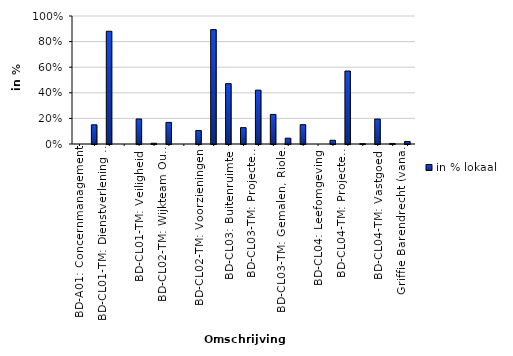
| Category | in % lokaal |
|---|---|
| BD-A01: Concernmanagement | 0 |
| BD-CL01: Dienstverlening, Veiligheid & Bestuur | 0.15 |
| BD-CL01-TM: Dienstverlening & Communicatie | 0.881 |
| BD-CL01-TM: Burgerzaken | 0 |
| BD-CL01-TM: Veiligheid | 0.196 |
| BD-CL01-TM: Bestuursadvies & -ondersteuning | 0.006 |
| BD-CL02-TM: Wijkteam Oud Barendrecht | 0.169 |
| BD-CL02-TM: Wijkteam Carnisselande | 0 |
| BD-CL02-TM: Voorzieningen | 0.106 |
| BD-CL02-TM: Beleid & Ondersteuning | 0.894 |
| BD-CL03: Buitenruimte | 0.472 |
| BD-CL03-TM: Beleid en Beheer Buitenruimte | 0.128 |
| BD-CL03-TM: Projecten Buitenruimte | 0.421 |
| BD-CL03-TM: Wijkbeheer, Bomen, Borden & Spelen | 0.231 |
| BD-CL03-TM: Gemalen, Riolering, Reiniging&Toezicht | 0.046 |
| BD-CL03-TM: Begraafplaatsen & Bedrijfsbureau | 0.151 |
| BD-CL04: Leefomgeving | 0 |
| BD-CL04-TM: Beleid Leefomgeving | 0.029 |
| BD-CL04-TM: Projecten Leefomgeving | 0.57 |
| BD-CL04-TM: Kwaliteit Leefomgeving | 0.003 |
| BD-CL04-TM: Vastgoed | 0.195 |
| BD-CL04-TM: Project De Stationstuinen | 0.004 |
| Griffie Barendrecht (vanaf 2024) | 0.02 |